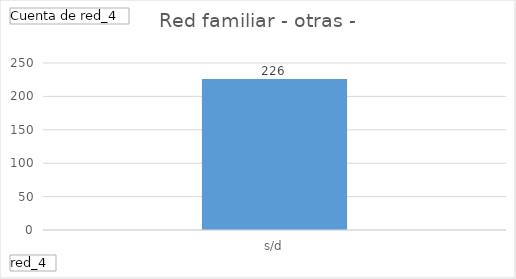
| Category | Total |
|---|---|
| s/d | 226 |